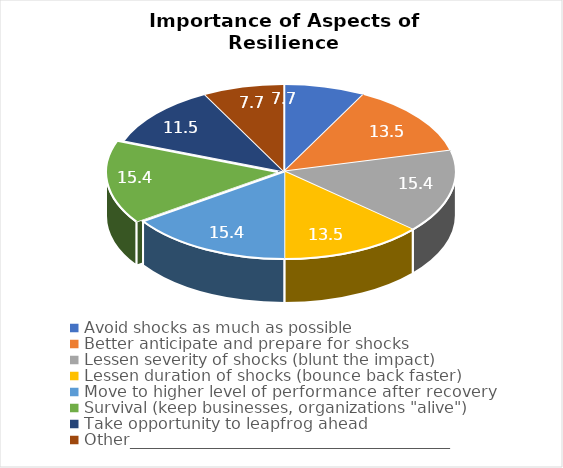
| Category | Percentage of Total |
|---|---|
| Avoid shocks as much as possible | 7.692 |
| Better anticipate and prepare for shocks | 13.462 |
| Lessen severity of shocks (blunt the impact) | 15.385 |
| Lessen duration of shocks (bounce back faster) | 13.462 |
| Move to higher level of performance after recovery | 15.385 |
| Survival (keep businesses, organizations "alive") | 15.385 |
| Take opportunity to leapfrog ahead | 11.538 |
| Other________________________________________ | 7.692 |